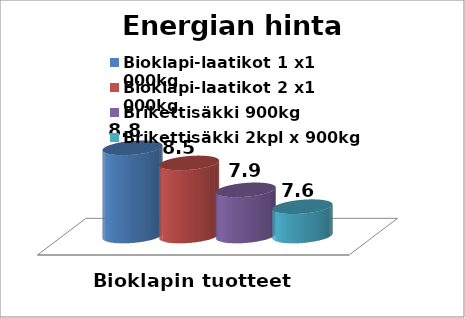
| Category | Bioklapi-laatikot 1 x1 000kg | Bioklapi-laatikot 2 x1 000kg | Brikettisäkki 900kg | Brikettisäkki 2kpl x 900kg |
|---|---|---|---|---|
| 0 | 8.812 | 8.501 | 7.948 | 7.602 |